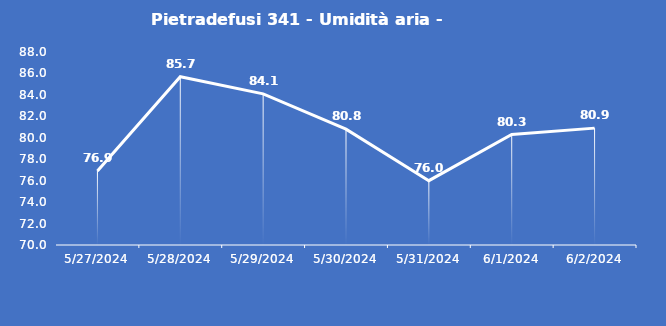
| Category | Pietradefusi 341 - Umidità aria - Grezzo (%) |
|---|---|
| 5/27/24 | 76.9 |
| 5/28/24 | 85.7 |
| 5/29/24 | 84.1 |
| 5/30/24 | 80.8 |
| 5/31/24 | 76 |
| 6/1/24 | 80.3 |
| 6/2/24 | 80.9 |